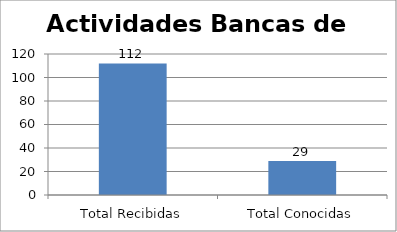
| Category | Series 0 |
|---|---|
| Total Recibidas | 112 |
| Total Conocidas | 29 |